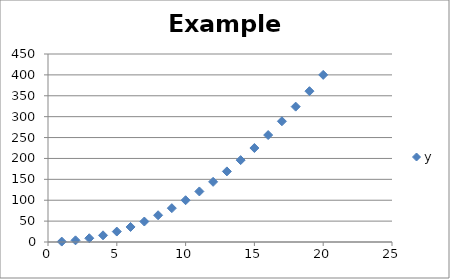
| Category | y |
|---|---|
| 1.0 | 1 |
| 2.0 | 4 |
| 3.0 | 9 |
| 4.0 | 16 |
| 5.0 | 25 |
| 6.0 | 36 |
| 7.0 | 49 |
| 8.0 | 64 |
| 9.0 | 81 |
| 10.0 | 100 |
| 11.0 | 121 |
| 12.0 | 144 |
| 13.0 | 169 |
| 14.0 | 196 |
| 15.0 | 225 |
| 16.0 | 256 |
| 17.0 | 289 |
| 18.0 | 324 |
| 19.0 | 361 |
| 20.0 | 400 |